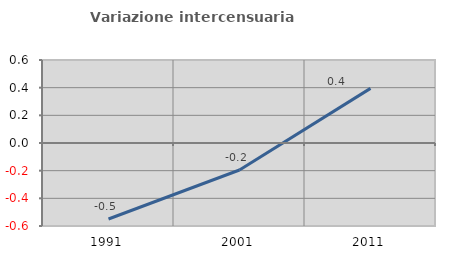
| Category | Variazione intercensuaria annua |
|---|---|
| 1991.0 | -0.549 |
| 2001.0 | -0.195 |
| 2011.0 | 0.395 |